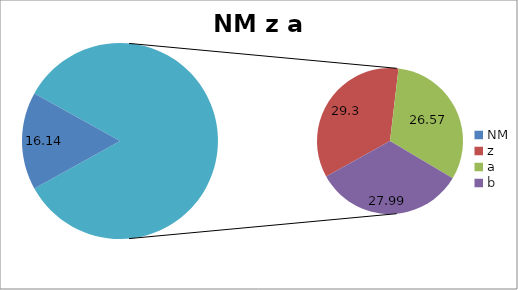
| Category | NM |
|---|---|
| NM | 16.14 |
| z | 29.3 |
| a | 26.57 |
| b | 27.99 |